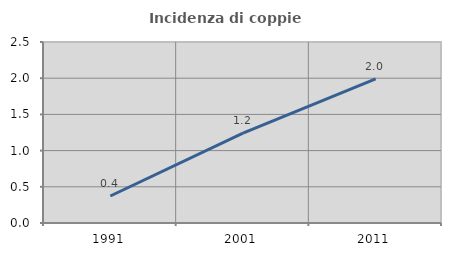
| Category | Incidenza di coppie miste |
|---|---|
| 1991.0 | 0.373 |
| 2001.0 | 1.243 |
| 2011.0 | 1.99 |